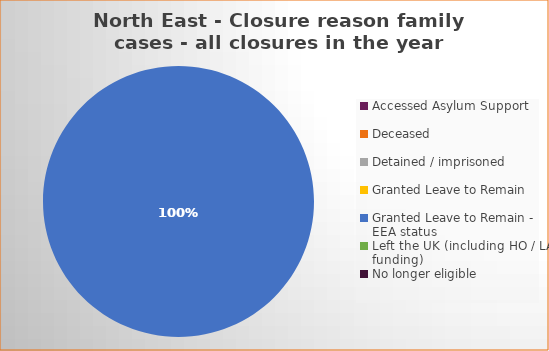
| Category | Total | Percentage |
|---|---|---|
| Accessed Asylum Support | 0 | 0 |
| Deceased | 0 | 0 |
| Detained / imprisoned | 0 | 0 |
| Granted Leave to Remain | 0 | 0 |
| Granted Leave to Remain - EEA status | 1 | 1 |
| Left the UK (including HO / LA funding)  | 0 | 0 |
| No longer eligible | 0 | 0 |